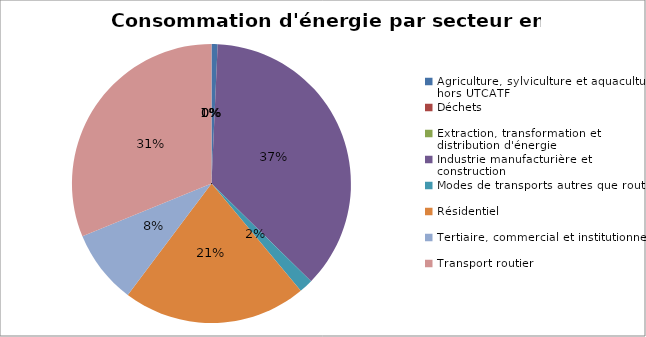
| Category | Series 0 |
|---|---|
| Agriculture, sylviculture et aquaculture hors UTCATF | 12395.95 |
| Déchets | 0 |
| Extraction, transformation et distribution d'énergie | 0 |
| Industrie manufacturière et construction | 642469.85 |
| Modes de transports autres que routier | 28115.88 |
| Résidentiel | 373415.18 |
| Tertiaire, commercial et institutionnel | 150102.19 |
| Transport routier | 546779.45 |